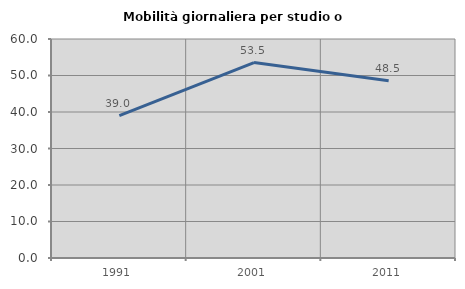
| Category | Mobilità giornaliera per studio o lavoro |
|---|---|
| 1991.0 | 39.009 |
| 2001.0 | 53.55 |
| 2011.0 | 48.538 |